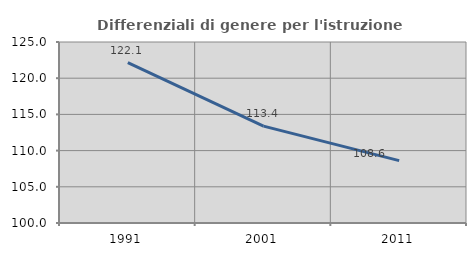
| Category | Differenziali di genere per l'istruzione superiore |
|---|---|
| 1991.0 | 122.147 |
| 2001.0 | 113.383 |
| 2011.0 | 108.614 |